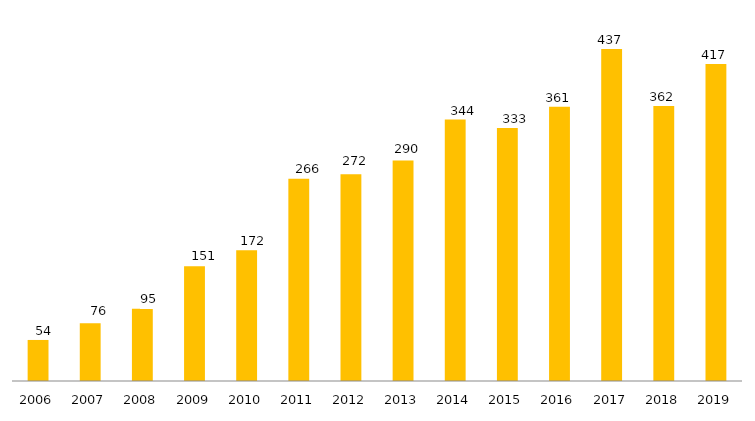
| Category | Programa |
|---|---|
| 2006.0 | 54 |
| 2007.0 | 76 |
| 2008.0 | 95 |
| 2009.0 | 151 |
| 2010.0 | 172 |
| 2011.0 | 266 |
| 2012.0 | 272 |
| 2013.0 | 290 |
| 2014.0 | 344 |
| 2015.0 | 333 |
| 2016.0 | 361 |
| 2017.0 | 437 |
| 2018.0 | 362 |
| 2019.0 | 417 |